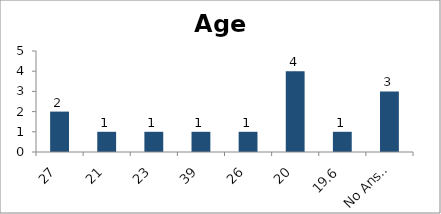
| Category | Age |
|---|---|
| 27 | 2 |
| 21 | 1 |
| 23 | 1 |
| 39 | 1 |
| 26 | 1 |
| 20 | 4 |
| 19.6 | 1 |
| No Answer | 3 |